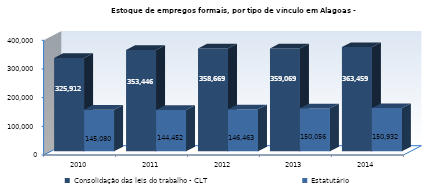
| Category | Consolidação das leis do trabalho - CLT | Estatutário |
|---|---|---|
| 2010.0 | 325912 | 145080 |
| 2011.0 | 353446 | 144452 |
| 2012.0 | 358669 | 146463 |
| 2013.0 | 359069 | 150056 |
| 2014.0 | 363459 | 150932 |